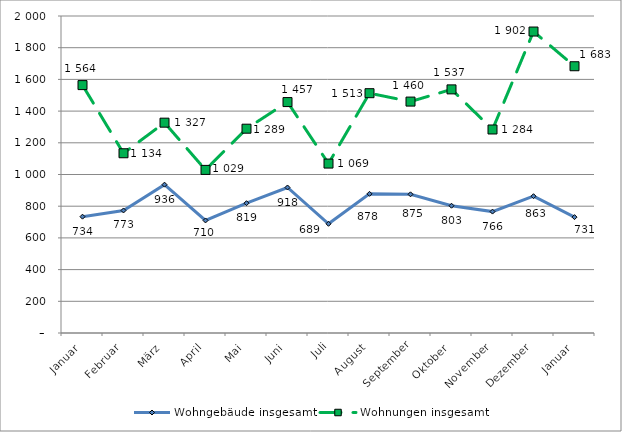
| Category | Wohngebäude insgesamt | Wohnungen insgesamt |
|---|---|---|
| Januar | 734 | 1564 |
| Februar | 773 | 1134 |
| März | 936 | 1327 |
| April | 710 | 1029 |
| Mai | 819 | 1289 |
| Juni | 918 | 1457 |
| Juli | 689 | 1069 |
| August | 878 | 1513 |
| September | 875 | 1460 |
| Oktober | 803 | 1537 |
| November | 766 | 1284 |
| Dezember | 863 | 1902 |
| Januar | 731 | 1683 |